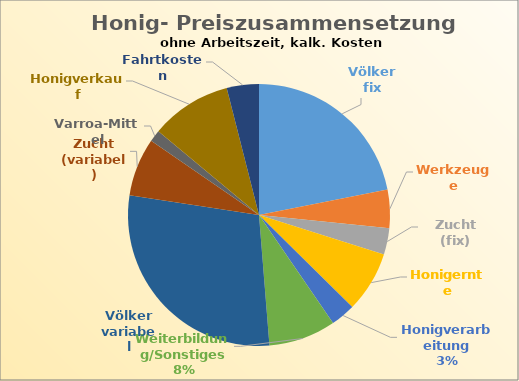
| Category | Series 0 |
|---|---|
| Völker fix | 0.699 |
| Werkzeuge | 0.151 |
| Zucht (fix) | 0.104 |
| Honigernte | 0.24 |
| Honigverarbeitung | 0.098 |
| Weiterbildung/Sonstiges | 0.264 |
| Völker variabel | 0.916 |
| Zucht (variabel) | 0.23 |
| Varroa-Mittel | 0.046 |
| Honigverkauf | 0.318 |
| Fahrtkosten | 0.127 |